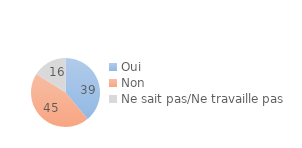
| Category | Series 0 |
|---|---|
| Oui | 39 |
| Non | 45 |
| Ne sait pas/Ne travaille pas | 16 |